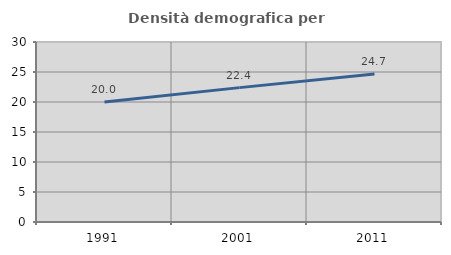
| Category | Densità demografica |
|---|---|
| 1991.0 | 20.001 |
| 2001.0 | 22.396 |
| 2011.0 | 24.671 |